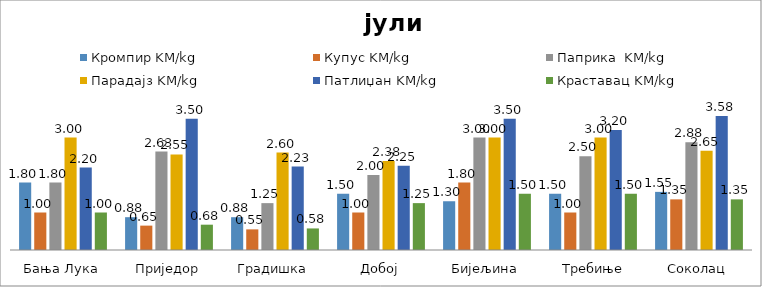
| Category | Кромпир KM/kg | Купус KM/kg | Паприка  KM/kg | Парадајз KM/kg | Патлиџан KM/kg | Краставац KM/kg |
|---|---|---|---|---|---|---|
| Бања Лука | 1.8 | 1 | 1.8 | 3 | 2.2 | 1 |
| Приједор | 0.875 | 0.65 | 2.625 | 2.55 | 3.5 | 0.675 |
| Градишка | 0.875 | 0.55 | 1.25 | 2.6 | 2.225 | 0.575 |
| Добој | 1.5 | 1 | 2 | 2.375 | 2.25 | 1.25 |
| Бијељина | 1.3 | 1.8 | 3 | 3 | 3.5 | 1.5 |
|  Требиње | 1.5 | 1 | 2.5 | 3 | 3.2 | 1.5 |
| Соколац | 1.55 | 1.35 | 2.875 | 2.65 | 3.575 | 1.35 |